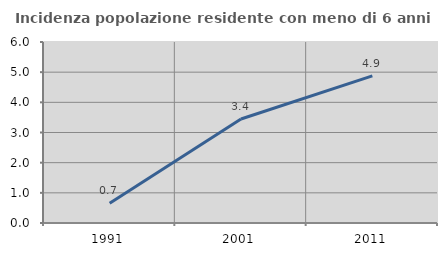
| Category | Incidenza popolazione residente con meno di 6 anni |
|---|---|
| 1991.0 | 0.658 |
| 2001.0 | 3.448 |
| 2011.0 | 4.878 |